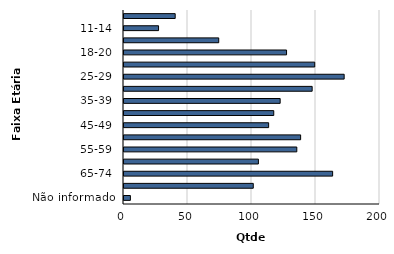
| Category | Qtde Vítimas |
|---|---|
| Não informado | 5 |
| 75+ | 101 |
| 65-74 | 163 |
| 60-64 | 105 |
| 55-59 | 135 |
| 50-54 | 138 |
| 45-49 | 113 |
| 40-44 | 117 |
| 35-39 | 122 |
| 30-34 | 147 |
| 25-29 | 172 |
| 21-24 | 149 |
| 18-20 | 127 |
| 15-17 | 74 |
| 11-14 | 27 |
| 0-10 | 40 |